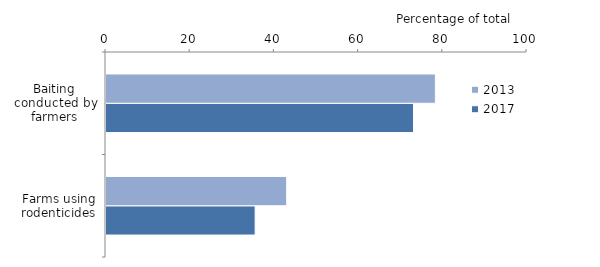
| Category | 2017 | 2013 |
|---|---|---|
| Farms using rodenticides | 35.424 | 42.918 |
| Baiting conducted by farmers | 73.042 | 78.243 |